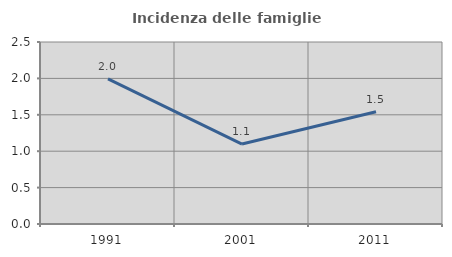
| Category | Incidenza delle famiglie numerose |
|---|---|
| 1991.0 | 1.993 |
| 2001.0 | 1.098 |
| 2011.0 | 1.542 |